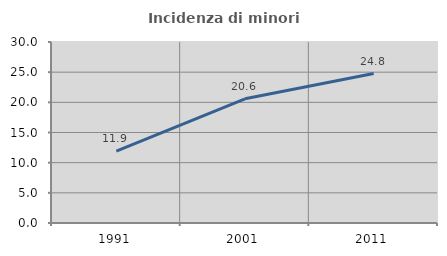
| Category | Incidenza di minori stranieri |
|---|---|
| 1991.0 | 11.905 |
| 2001.0 | 20.581 |
| 2011.0 | 24.764 |